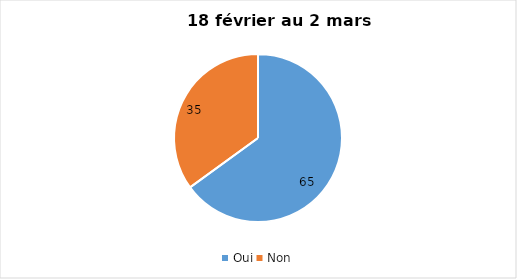
| Category | 18 février au 2 mars  2022 |
|---|---|
| Oui | 65 |
| Non | 35 |